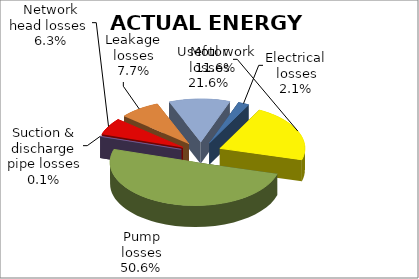
| Category | 3.4  ACTUAL ENERGY BALANCE |
|---|---|
| Electrical losses | 1537.874 |
| Motor losses | 15920.412 |
| Pump losses | 37241.849 |
| Suction & discharge pipe losses | 52.452 |
| Network head losses  | 4652.843 |
| Leakage losses | 5698.205 |
| Useful work | 8547.308 |